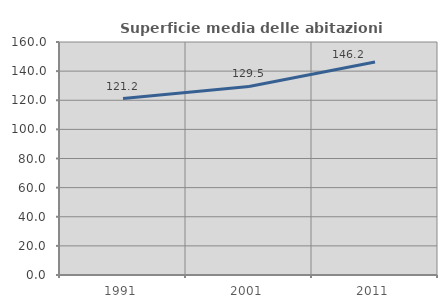
| Category | Superficie media delle abitazioni occupate |
|---|---|
| 1991.0 | 121.195 |
| 2001.0 | 129.464 |
| 2011.0 | 146.217 |